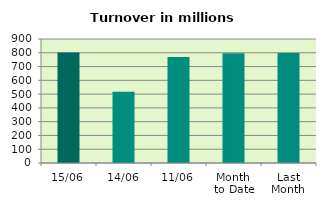
| Category | Series 0 |
|---|---|
| 15/06 | 801.129 |
| 14/06 | 517.884 |
| 11/06 | 769.994 |
| Month 
to Date | 796.722 |
| Last
Month | 798.504 |